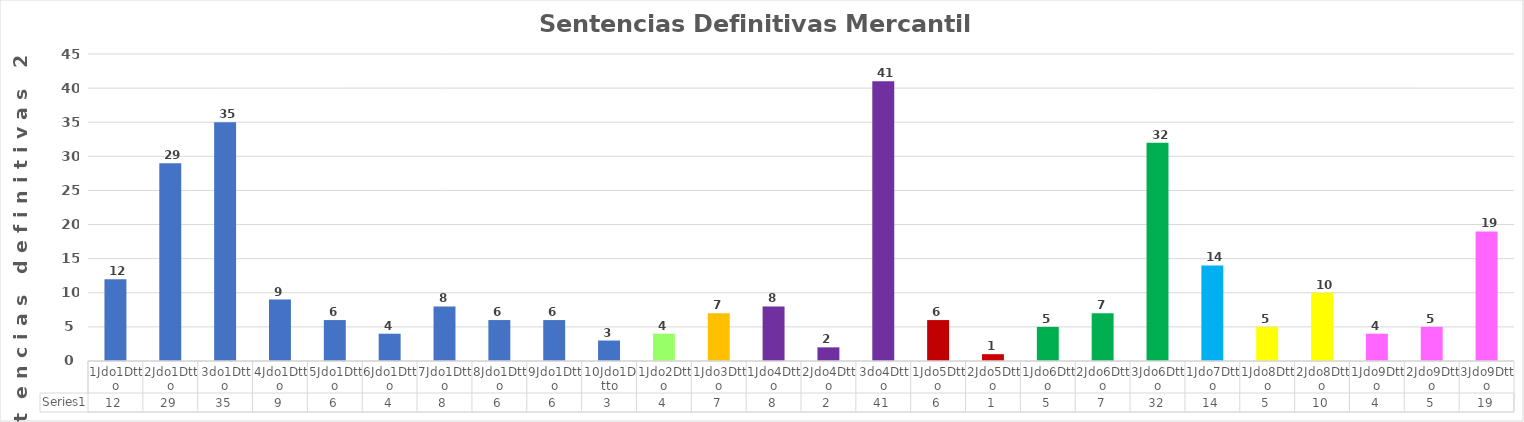
| Category | Series 0 |
|---|---|
| 1Jdo1Dtto | 12 |
| 2Jdo1Dtto | 29 |
| 3do1Dtto | 35 |
| 4Jdo1Dtto | 9 |
| 5Jdo1Dtto | 6 |
| 6Jdo1Dtto | 4 |
| 7Jdo1Dtto | 8 |
| 8Jdo1Dtto | 6 |
| 9Jdo1Dtto | 6 |
| 10Jdo1Dtto | 3 |
| 1Jdo2Dtto | 4 |
| 1Jdo3Dtto | 7 |
| 1Jdo4Dtto | 8 |
| 2Jdo4Dtto | 2 |
| 3do4Dtto | 41 |
| 1Jdo5Dtto | 6 |
| 2Jdo5Dtto | 1 |
| 1Jdo6Dtto | 5 |
| 2Jdo6Dtto | 7 |
| 3Jdo6Dtto | 32 |
| 1Jdo7Dtto | 14 |
| 1Jdo8Dtto | 5 |
| 2Jdo8Dtto | 10 |
| 1Jdo9Dtto | 4 |
| 2Jdo9Dtto | 5 |
| 3Jdo9Dtto | 19 |